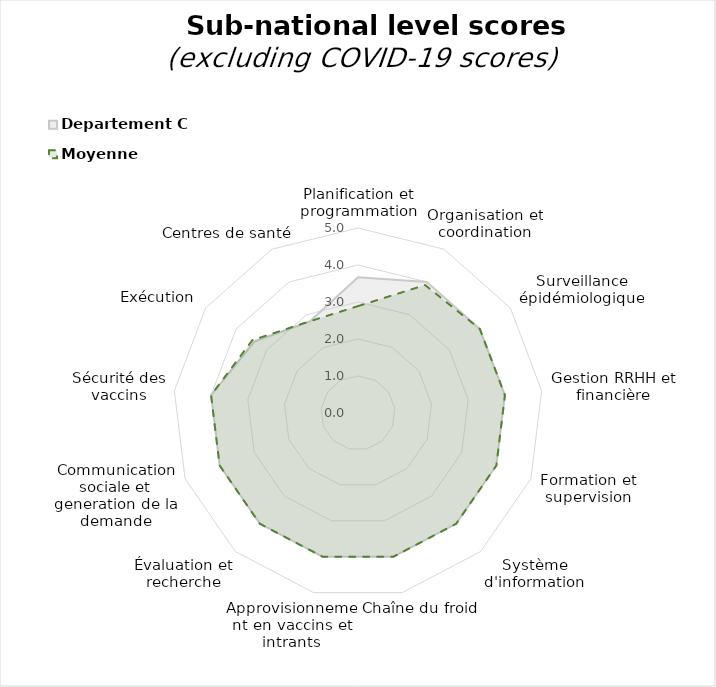
| Category | Departement C | Moyenne |
|---|---|---|
| Planification et programmation | 3.667 | 2.889 |
| Organisation et coordination | 4 | 3.905 |
| Surveillance épidémiologique | 4 | 4 |
| Gestion RRHH et financière | 4 | 4 |
| Formation et supervision | 4 | 4 |
| Système d'information | 4 | 4 |
| Chaîne du froid | 4 | 4 |
| Approvisionnement en vaccins et intrants | 4 | 4 |
| Évaluation et recherche | 4 | 4 |
| Communication sociale et generation de la demande | 4 | 4 |
| Sécurité des vaccins | 4 | 4 |
| Exécution | 3.4 | 3.467 |
| Centres de santé | 2.8 | 2.8 |